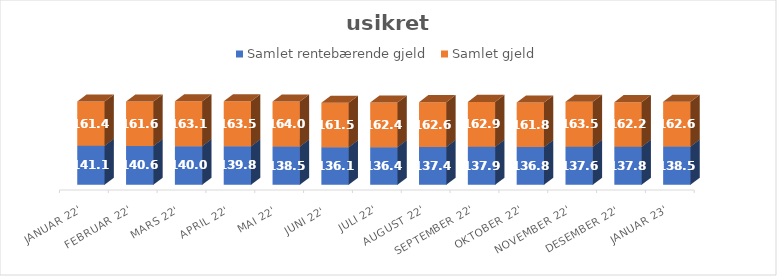
| Category | Samlet rentebærende gjeld | Samlet gjeld |
|---|---|---|
| Januar 22' | 141.056 | 161.388 |
| Februar 22' | 140.559 | 161.598 |
| Mars 22' | 139.994 | 163.08 |
| April 22' | 139.789 | 163.515 |
| Mai 22' | 138.464 | 163.993 |
| Juni 22' | 136.125 | 161.517 |
| Juli 22' | 136.418 | 162.387 |
| August 22' | 137.353 | 162.551 |
| September 22' | 137.939 | 162.943 |
| Oktober 22' | 136.791 | 161.815 |
| November 22' | 137.642 | 163.465 |
| Desember 22' | 137.754 | 162.215 |
| Januar 23' | 138.478 | 162.586 |